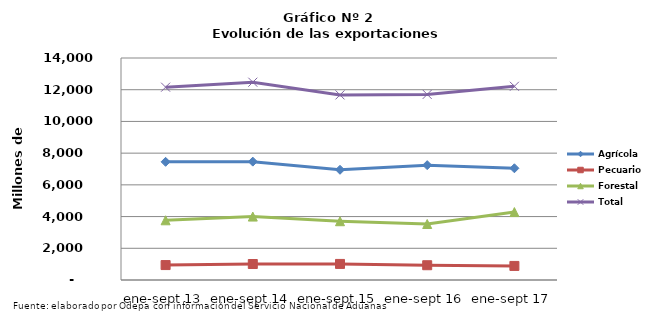
| Category | Agrícola | Pecuario | Forestal | Total |
|---|---|---|---|---|
| ene-sept 13 | 7452193 | 941268 | 3765902 | 12159363 |
| ene-sept 14 | 7464614 | 1008876 | 4000388 | 12473878 |
| ene-sept 15 | 6951053 | 1013702 | 3706848 | 11671603 |
| ene-sept 16 | 7242570 | 931228 | 3530679 | 11704477 |
| ene-sept 17 | 7045628 | 887304 | 4283932 | 12216864 |